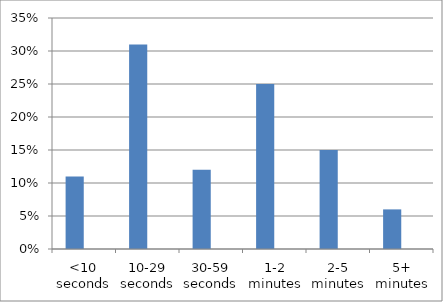
| Category | Series 0 | Series 1 |
|---|---|---|
| <10 seconds | 0.11 | 0 |
| 10-29 seconds | 0.31 | 0 |
| 30-59 seconds | 0.12 | 0 |
| 1-2 minutes | 0.25 | 0 |
| 2-5 minutes | 0.15 | 0 |
| 5+ minutes | 0.06 | 0 |